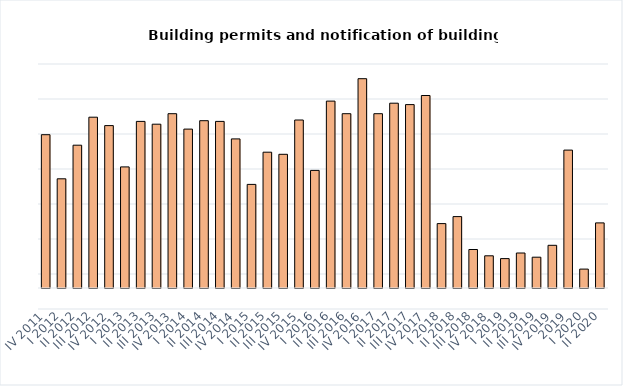
| Category | Building permits and notification of building work |
|---|---|
| IV 2011 | 219 |
| I 2012 | 156 |
| II 2012 | 204 |
| III 2012 | 244 |
| IV 2012 | 232 |
| I 2013 | 173 |
| II 2013 | 238 |
| III 2013 | 234 |
| IV 2013 | 249 |
| I 2014 | 227 |
| II 2014 | 239 |
| III 2014 | 238 |
| IV 2014 | 213 |
| I 2015 | 148 |
| II 2015 | 194 |
| III 2015 | 191 |
| IV 2015 | 240 |
| I 2016 | 168 |
| II 2016 | 267 |
| III 2016 | 249 |
| IV 2016 | 299 |
| I 2017 | 249 |
| II 2017 | 264 |
| III 2017 | 262 |
| IV 2017 | 275 |
| I 2018 | 92 |
| II 2018 | 102 |
| III 2018 | 55 |
| IV 2018 | 46 |
| I 2019 | 42 |
| II 2019 | 50 |
| III 2019 | 44 |
| IV 2019 | 61 |
| 2019 | 197 |
| I 2020 | 27 |
| II 2020 | 93 |